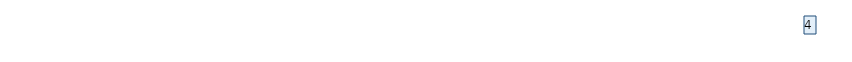
| Category | Итоговая оценка |
|---|---|
| Вопрос 1 | 4 |